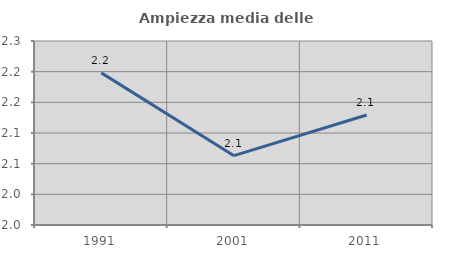
| Category | Ampiezza media delle famiglie |
|---|---|
| 1991.0 | 2.198 |
| 2001.0 | 2.063 |
| 2011.0 | 2.129 |